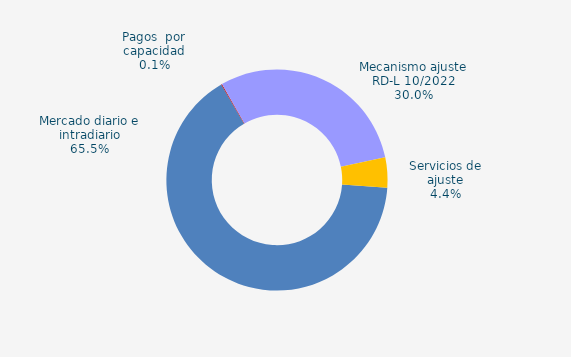
| Category | Series 0 |
|---|---|
| Mercado diario e intradiario | 142.21 |
| Pagos  por capacidad | 0.25 |
| Mecanismo ajuste RD-L 10/2022 | 65.19 |
| Servicios de ajuste | 9.54 |